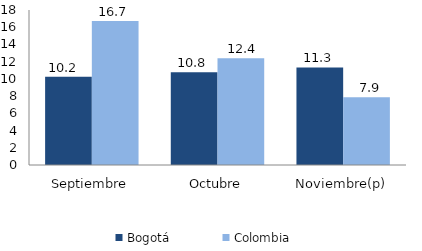
| Category | Bogotá | Colombia |
|---|---|---|
| Septiembre | 10.241 | 16.736 |
| Octubre | 10.78 | 12.405 |
| Noviembre(p) | 11.336 | 7.876 |